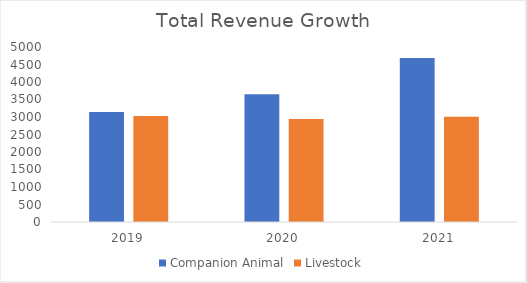
| Category | Companion Animal | Livestock |
|---|---|---|
| 2019.0 | 3145 | 3030 |
| 2020.0 | 3652 | 2940 |
| 2021.0 | 4689 | 3005 |